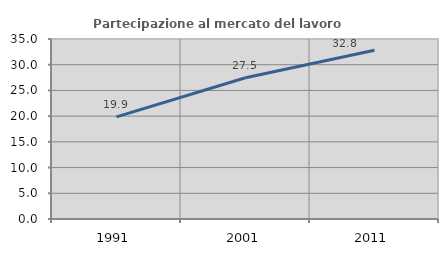
| Category | Partecipazione al mercato del lavoro  femminile |
|---|---|
| 1991.0 | 19.868 |
| 2001.0 | 27.473 |
| 2011.0 | 32.824 |